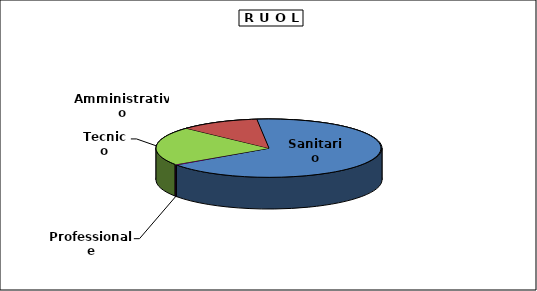
| Category | Personale |
|---|---|
| Professionale | 16 |
| Tecnico | 1170 |
| Amministrativo | 621 |
| Sanitario | 3668 |